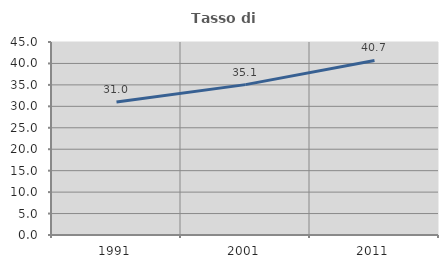
| Category | Tasso di occupazione   |
|---|---|
| 1991.0 | 31.002 |
| 2001.0 | 35.063 |
| 2011.0 | 40.695 |